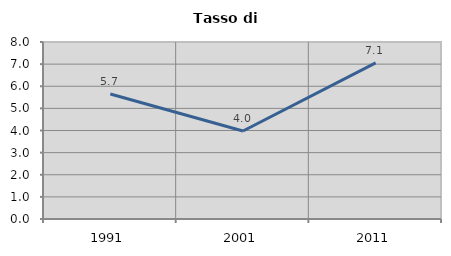
| Category | Tasso di disoccupazione   |
|---|---|
| 1991.0 | 5.651 |
| 2001.0 | 3.978 |
| 2011.0 | 7.06 |